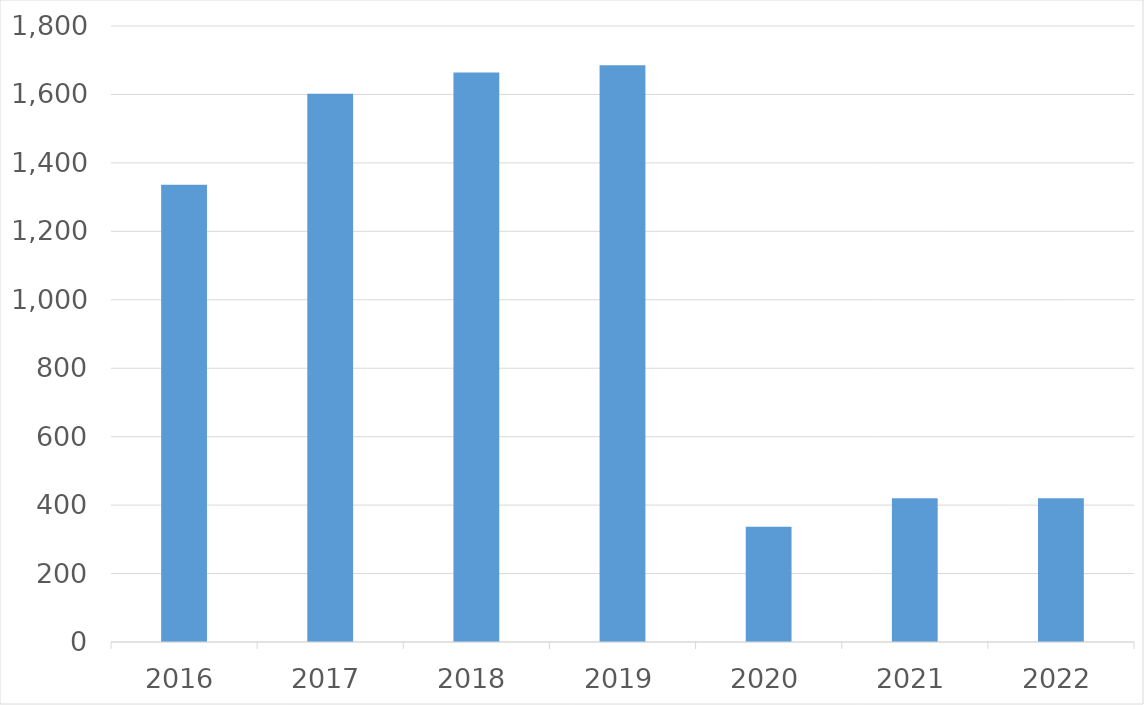
| Category | Series 0 |
|---|---|
| 2016 | 1336 |
| 2017 | 1602 |
| 2018 | 1664 |
| 2019 | 1685 |
| 2020 | 337 |
| 2021 | 420 |
| 2022 | 420 |